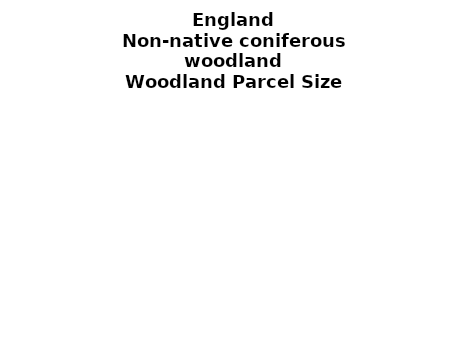
| Category | Non-native coniferous woodland |
|---|---|
| <5 ha | 0.082 |
| ≥5 and <10 ha | 0.038 |
| ≥10 and <15 ha | 0.022 |
| ≥15 and <20 ha | 0.023 |
| ≥20 and <25 ha | 0.014 |
| ≥25 and <30 ha | 0.021 |
| ≥30 and <35 ha | 0.016 |
| ≥35 and <40 ha | 0.017 |
| ≥40 and <45 ha | 0.013 |
| ≥45 and <50 ha | 0.014 |
| ≥50 and <60 ha | 0.036 |
| ≥60 and <70 ha | 0.03 |
| ≥70 and <80 ha | 0.022 |
| ≥80 and <90 ha | 0.018 |
| ≥90 and <100 ha | 0.021 |
| ≥100 and <150 ha | 0.07 |
| ≥150 and <200 ha | 0.063 |
| ≥200 ha | 0.479 |